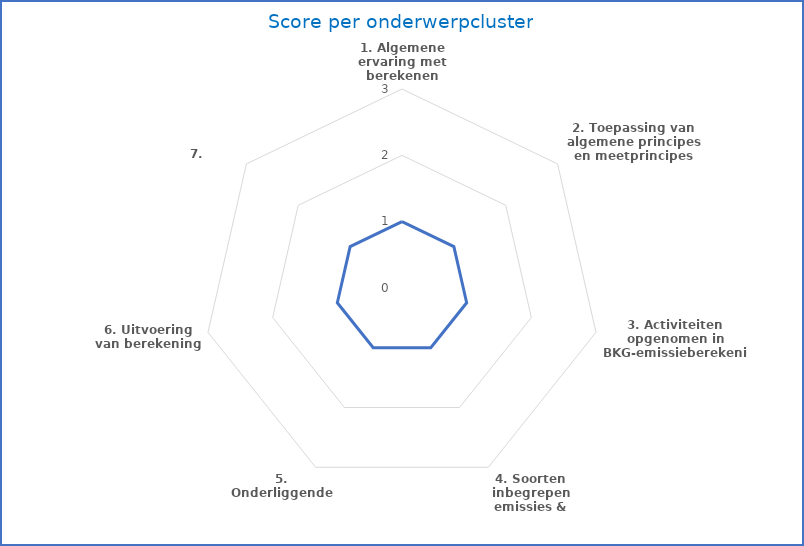
| Category | Series 0 |
|---|---|
| 1. Algemene ervaring met berekenen BKG-emissie | 1 |
| 2. Toepassing van algemene principes en meetprincipes | 1 |
| 3. Activiteiten opgenomen in BKG-emissieberekening | 1 |
| 4. Soorten inbegrepen emissies & gebruikte emissiefactoren | 1 |
| 5. Onderliggende gegevens | 1 |
| 6. Uitvoering van berekening | 1 |
| 7. Rapportage | 1 |